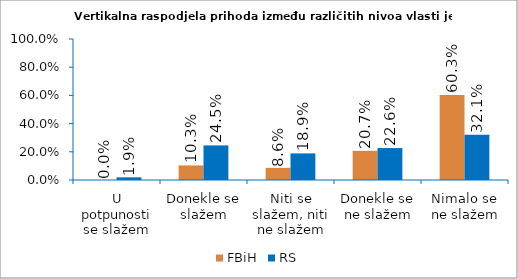
| Category | FBiH | RS |
|---|---|---|
| U potpunosti se slažem | 0 | 0.019 |
| Donekle se slažem | 0.103 | 0.245 |
| Niti se slažem, niti ne slažem | 0.086 | 0.189 |
| Donekle se ne slažem | 0.207 | 0.226 |
| Nimalo se ne slažem | 0.603 | 0.321 |